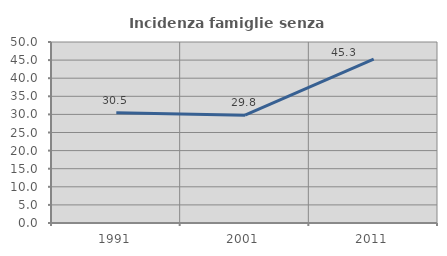
| Category | Incidenza famiglie senza nuclei |
|---|---|
| 1991.0 | 30.472 |
| 2001.0 | 29.776 |
| 2011.0 | 45.268 |